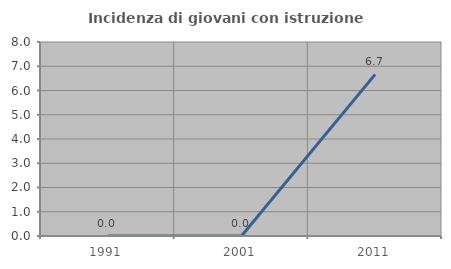
| Category | Incidenza di giovani con istruzione universitaria |
|---|---|
| 1991.0 | 0 |
| 2001.0 | 0 |
| 2011.0 | 6.667 |